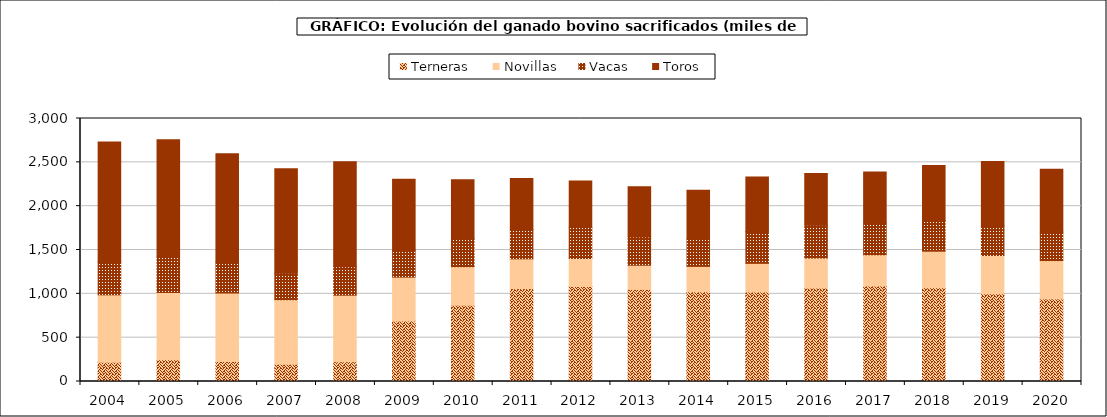
| Category | Terneras | Novillas | Vacas | Toros |
|---|---|---|---|---|
| 2004.0 | 220.638 | 767.767 | 380.128 | 1363.513 |
| 2005.0 | 246.944 | 769.645 | 400.576 | 1340.393 |
| 2006.0 | 227.871 | 780.95 | 355.484 | 1234.79 |
| 2007.0 | 197.822 | 735.107 | 301.795 | 1193.259 |
| 2008.0 | 225.783 | 758.655 | 323.877 | 1198.419 |
| 2009.0 | 690.106 | 500.364 | 312.199 | 803.926 |
| 2010.0 | 869.716 | 439.941 | 318.432 | 674 |
| 2011.0 | 1059.2 | 339.951 | 331.79 | 583.811 |
| 2012.0 | 1083.19 | 319.983 | 353.838 | 528.913 |
| 2013.0 | 1050.071 | 276.098 | 323.4 | 572.434 |
| 2014.0 | 1023.638 | 289.637 | 314.523 | 554.792 |
| 2015.0 | 1021.185 | 326.435 | 364.083 | 622.192 |
| 2016.0 | 1065.529 | 342.877 | 373.921 | 591.523 |
| 2017.0 | 1089.661 | 355.447 | 361.984 | 583.911 |
| 2018.0 | 1069.502 | 416.616 | 352.939 | 623.5 |
| 2019.0 | 999.724 | 437.599 | 342.647 | 730.804 |
| 2020.0 | 940.58 | 438.587 | 324.878 | 718.36 |